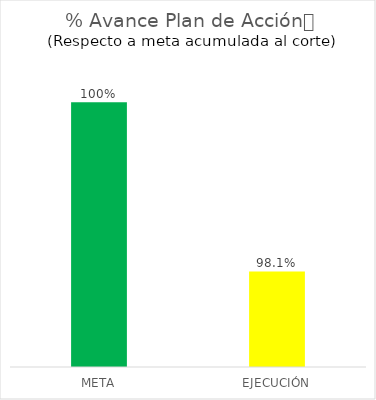
| Category | % Avance Plan de Acción
(Respecto a meta acumulada al corte) |
|---|---|
| META | 1 |
| EJECUCIÓN | 0.981 |